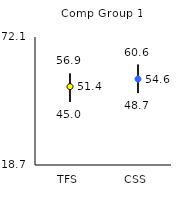
| Category | 25th | 75th | Mean |
|---|---|---|---|
| TFS | 45 | 56.9 | 51.4 |
| CSS | 48.7 | 60.6 | 54.57 |